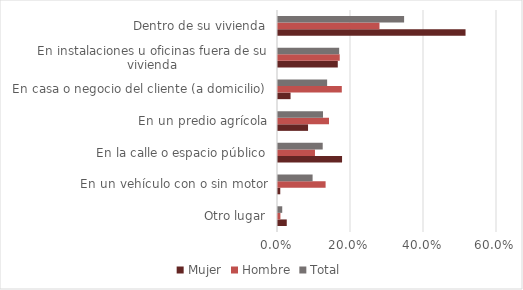
| Category | Mujer | Hombre | Total |
|---|---|---|---|
| Otro lugar | 0.024 | 0.007 | 0.012 |
| En un vehículo con o sin motor | 0.006 | 0.13 | 0.095 |
| En la calle o espacio público | 0.176 | 0.101 | 0.122 |
| En un predio agrícola | 0.082 | 0.14 | 0.123 |
| En casa o negocio del cliente (a domicilio) | 0.034 | 0.175 | 0.135 |
| En instalaciones u oficinas fuera de su vivienda | 0.164 | 0.169 | 0.168 |
| Dentro de su vivienda | 0.514 | 0.278 | 0.346 |